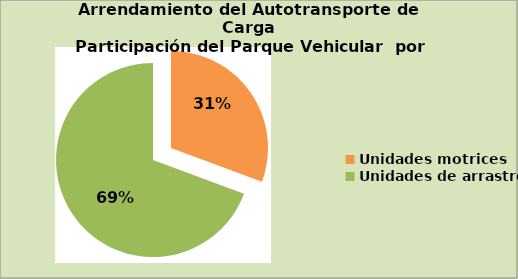
| Category | Series 0 |
|---|---|
| Unidades motrices | 30.643 |
| Unidades de arrastre | 69.357 |